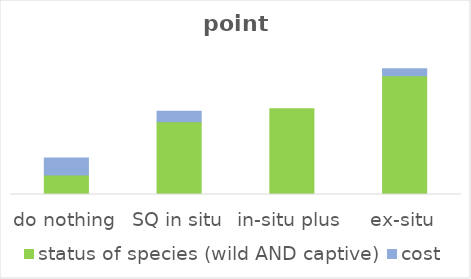
| Category | status of species (wild AND captive) | cost |
|---|---|---|
| do nothing | 0.104 | 0.091 |
| SQ in situ | 0.391 | 0.056 |
| in-situ plus | 0.461 | 0 |
| ex-situ | 0.637 | 0.038 |